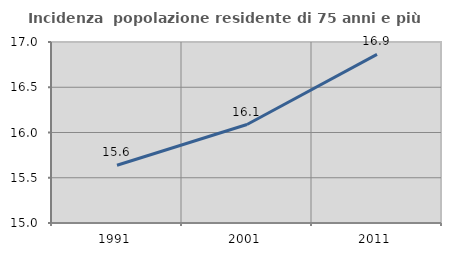
| Category | Incidenza  popolazione residente di 75 anni e più |
|---|---|
| 1991.0 | 15.638 |
| 2001.0 | 16.088 |
| 2011.0 | 16.863 |